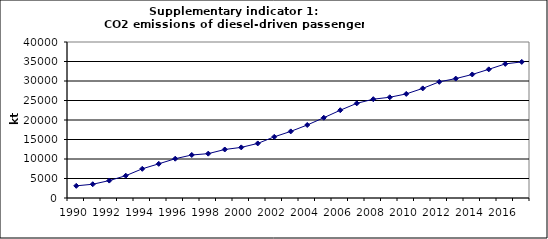
| Category | CO2 emissions of diesel-driven passenger cars, kt |
|---|---|
| 1990 | 3117.76 |
| 1991 | 3527.279 |
| 1992 | 4465.076 |
| 1993 | 5714.398 |
| 1994 | 7487.208 |
| 1995 | 8762.533 |
| 1996 | 10073.752 |
| 1997 | 11029.335 |
| 1998 | 11373.996 |
| 1999 | 12436.786 |
| 2000 | 12979.439 |
| 2001 | 13993.536 |
| 2002 | 15681.834 |
| 2003 | 17076.318 |
| 2004 | 18718.971 |
| 2005 | 20578.824 |
| 2006 | 22504.691 |
| 2007 | 24273.221 |
| 2008 | 25335.305 |
| 2009 | 25829.678 |
| 2010 | 26688.246 |
| 2011 | 28105.341 |
| 2012 | 29787.254 |
| 2013 | 30615.524 |
| 2014 | 31675.567 |
| 2015 | 32990.62 |
| 2016 | 34386.608 |
| 2017 | 34893.842 |